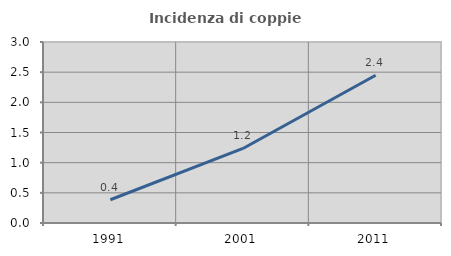
| Category | Incidenza di coppie miste |
|---|---|
| 1991.0 | 0.385 |
| 2001.0 | 1.235 |
| 2011.0 | 2.448 |